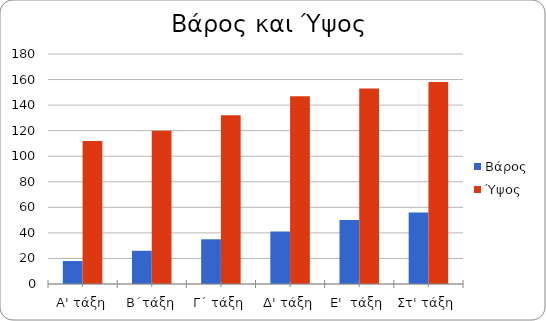
| Category | Βάρος | Ύψος |
|---|---|---|
| Α' τάξη | 18 | 112 |
| Β΄τάξη | 26 | 120 |
| Γ΄ τάξη | 35 | 132 |
| Δ' τάξη | 41 | 147 |
| Ε'  τάξη | 50 | 153 |
| Στ' τάξη | 56 | 158 |